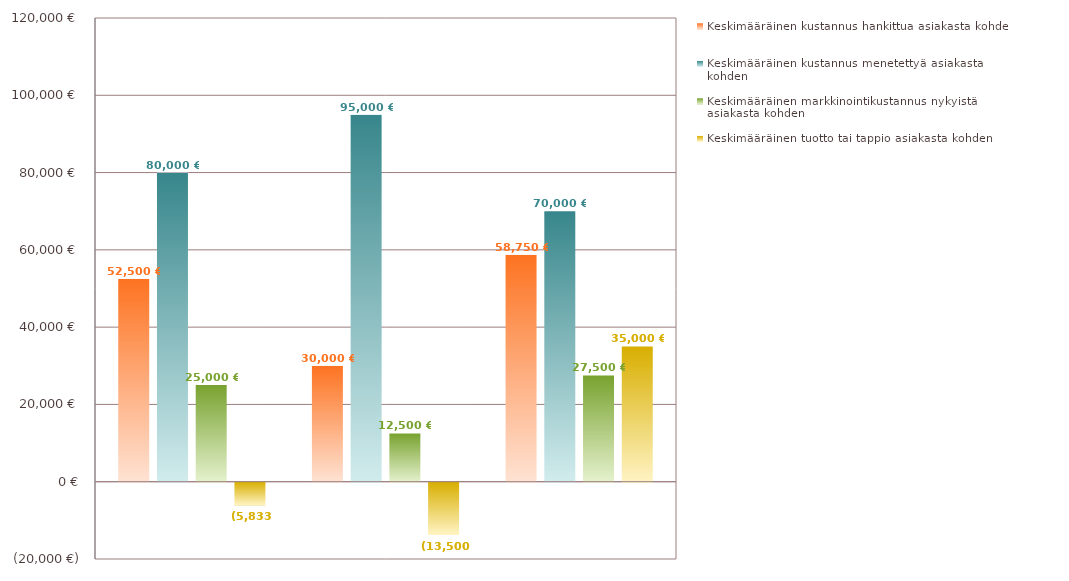
| Category | Keskimääräinen kustannus hankittua asiakasta kohden | Keskimääräinen kustannus menetettyä asiakasta kohden | Keskimääräinen markkinointikustannus nykyistä asiakasta kohden | Keskimääräinen tuotto tai tappio asiakasta kohden |
|---|---|---|---|---|
|  | 52500 | 80000 | 25000 | -5833.333 |
|  | 30000 | 95000 | 12500 | -13500 |
|  | 58750 | 70000 | 27500 | 35000 |